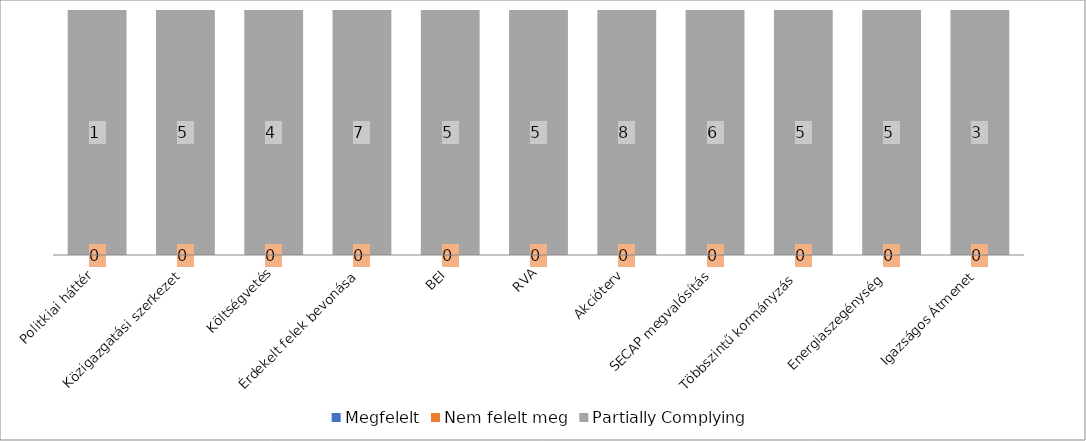
| Category | Megfelelt | Nem felelt meg | Partially Complying |
|---|---|---|---|
| Politkiai háttér  | 0 | 0 | 1 |
| Közigazgatási szerkezet | 0 | 0 | 5 |
| Költségvetés | 0 | 0 | 4 |
| Érdekelt felek bevonása | 0 | 0 | 7 |
| BEI | 0 | 0 | 5 |
| RVA | 0 | 0 | 5 |
| Akcióterv | 0 | 0 | 8 |
| SECAP megvalósítás | 0 | 0 | 6 |
| Többszintű kormányzás  | 0 | 0 | 5 |
| Energiaszegénység  | 0 | 0 | 5 |
| Igazságos Átmenet | 0 | 0 | 3 |